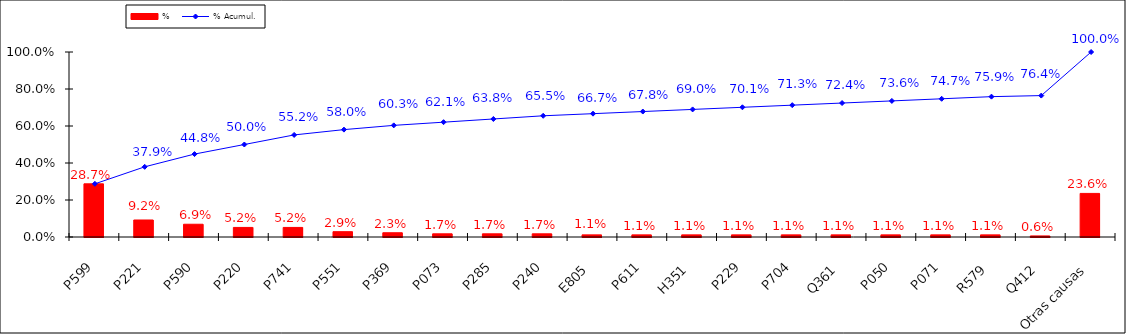
| Category | % |
|---|---|
| P599 | 0.287 |
| P221 | 0.092 |
| P590 | 0.069 |
| P220 | 0.052 |
| P741 | 0.052 |
| P551 | 0.029 |
| P369 | 0.023 |
| P073 | 0.017 |
| P285 | 0.017 |
| P240 | 0.017 |
| E805 | 0.011 |
| P611 | 0.011 |
| H351 | 0.011 |
| P229 | 0.011 |
| P704 | 0.011 |
| Q361 | 0.011 |
| P050 | 0.011 |
| P071 | 0.011 |
| R579 | 0.011 |
| Q412 | 0.006 |
| Otras causas | 0.236 |